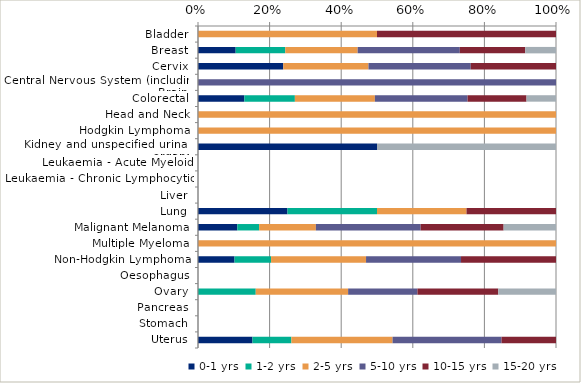
| Category | 0-1 yrs | 1-2 yrs | 2-5 yrs | 5-10 yrs | 10-15 yrs | 15-20 yrs |
|---|---|---|---|---|---|---|
| Bladder | 0 | 0 | 0.5 | 0 | 0.5 | 0 |
| Breast | 0.105 | 0.139 | 0.202 | 0.285 | 0.183 | 0.086 |
| Cervix | 0.238 | 0 | 0.238 | 0.286 | 0.238 | 0 |
| Central Nervous System (including Brain) | 0 | 0 | 0 | 1 | 0 | 0 |
| Colorectal | 0.129 | 0.141 | 0.224 | 0.259 | 0.165 | 0.082 |
| Head and Neck | 0 | 0 | 1 | 0 | 0 | 0 |
| Hodgkin Lymphoma | 0 | 0 | 1 | 0 | 0 | 0 |
| Kidney and unspecified urinary organs | 0.5 | 0 | 0 | 0 | 0 | 0.5 |
| Leukaemia - Acute Myeloid | 0 | 0 | 0 | 0 | 0 | 0 |
| Leukaemia - Chronic Lymphocytic | 0 | 0 | 0 | 0 | 0 | 0 |
| Liver | 0 | 0 | 0 | 0 | 0 | 0 |
| Lung | 0.25 | 0.25 | 0.25 | 0 | 0.25 | 0 |
| Malignant Melanoma | 0.11 | 0.061 | 0.159 | 0.293 | 0.232 | 0.146 |
| Multiple Myeloma | 0 | 0 | 1 | 0 | 0 | 0 |
| Non-Hodgkin Lymphoma | 0.102 | 0.102 | 0.265 | 0.265 | 0.265 | 0 |
| Oesophagus | 0 | 0 | 0 | 0 | 0 | 0 |
| Ovary | 0 | 0.161 | 0.258 | 0.194 | 0.226 | 0.161 |
| Pancreas | 0 | 0 | 0 | 0 | 0 | 0 |
| Stomach | 0 | 0 | 0 | 0 | 0 | 0 |
| Uterus | 0.152 | 0.109 | 0.283 | 0.304 | 0.152 | 0 |